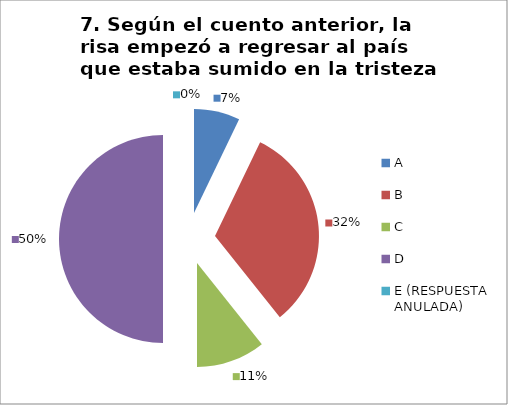
| Category | CANTIDAD DE RESPUESTAS PREGUNTA (7) | PORCENTAJE |
|---|---|---|
| A | 2 | 0.071 |
| B | 9 | 0.321 |
| C | 3 | 0.107 |
| D | 14 | 0.5 |
| E (RESPUESTA ANULADA) | 0 | 0 |